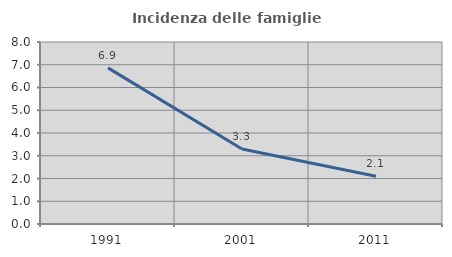
| Category | Incidenza delle famiglie numerose |
|---|---|
| 1991.0 | 6.863 |
| 2001.0 | 3.298 |
| 2011.0 | 2.1 |